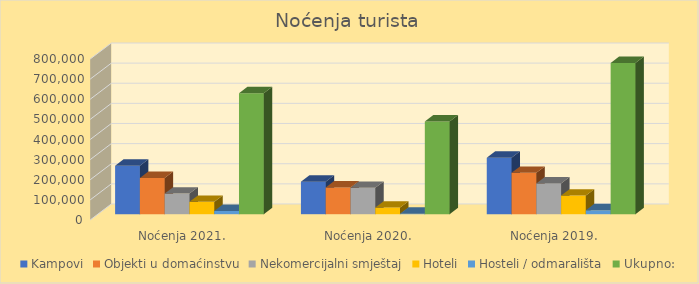
| Category | Kampovi | Objekti u domaćinstvu | Nekomercijalni smještaj | Hoteli | Hosteli / odmarališta | Ukupno: |
|---|---|---|---|---|---|---|
| Noćenja 2021. | 241379 | 180342 | 102556 | 61349 | 15984 | 601610 |
| Noćenja 2020. | 161790 | 133118 | 130969 | 32768 | 2517 | 461162 |
| Noćenja 2019. | 280743 | 205423 | 153024 | 92750 | 19570 | 751510 |